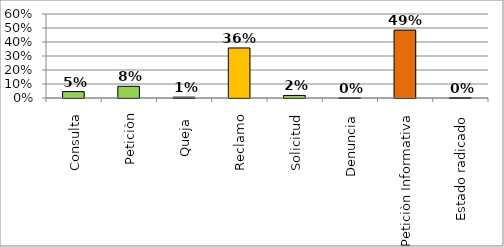
| Category | Series 0 |
|---|---|
| Consulta | 0.046 |
| Peticiòn | 0.084 |
| Queja  | 0.006 |
| Reclamo | 0.357 |
| Solicitud | 0.018 |
| Denuncia | 0.001 |
| Peticiòn Informativa | 0.485 |
| Estado radicado | 0.003 |